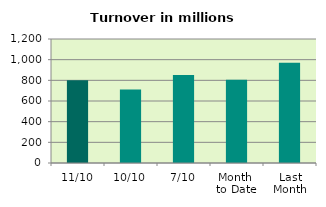
| Category | Series 0 |
|---|---|
| 11/10 | 801.409 |
| 10/10 | 712.078 |
| 7/10 | 850.773 |
| Month 
to Date | 805.857 |
| Last
Month | 970.98 |